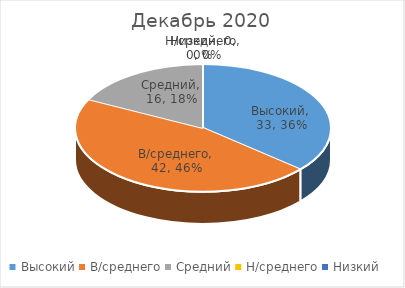
| Category | Декабрь 2020 |
|---|---|
| Высокий | 33 |
| В/среднего | 42 |
| Средний | 16 |
| Н/среднего | 0 |
| Низкий | 0 |